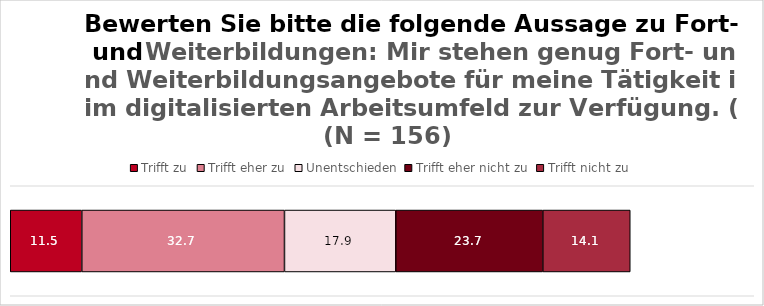
| Category | Trifft zu | Trifft eher zu | Unentschieden | Trifft eher nicht zu | Trifft nicht zu |
|---|---|---|---|---|---|
| 0 | 11.538 | 32.692 | 17.949 | 23.718 | 14.103 |